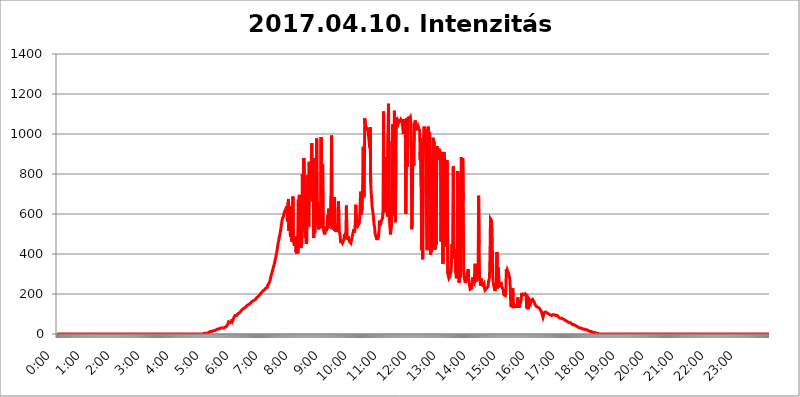
| Category | 2017.04.10. Intenzitás [W/m^2] |
|---|---|
| 0.0 | 0 |
| 0.0006944444444444445 | 0 |
| 0.001388888888888889 | 0 |
| 0.0020833333333333333 | 0 |
| 0.002777777777777778 | 0 |
| 0.003472222222222222 | 0 |
| 0.004166666666666667 | 0 |
| 0.004861111111111111 | 0 |
| 0.005555555555555556 | 0 |
| 0.0062499999999999995 | 0 |
| 0.006944444444444444 | 0 |
| 0.007638888888888889 | 0 |
| 0.008333333333333333 | 0 |
| 0.009027777777777779 | 0 |
| 0.009722222222222222 | 0 |
| 0.010416666666666666 | 0 |
| 0.011111111111111112 | 0 |
| 0.011805555555555555 | 0 |
| 0.012499999999999999 | 0 |
| 0.013194444444444444 | 0 |
| 0.013888888888888888 | 0 |
| 0.014583333333333332 | 0 |
| 0.015277777777777777 | 0 |
| 0.015972222222222224 | 0 |
| 0.016666666666666666 | 0 |
| 0.017361111111111112 | 0 |
| 0.018055555555555557 | 0 |
| 0.01875 | 0 |
| 0.019444444444444445 | 0 |
| 0.02013888888888889 | 0 |
| 0.020833333333333332 | 0 |
| 0.02152777777777778 | 0 |
| 0.022222222222222223 | 0 |
| 0.02291666666666667 | 0 |
| 0.02361111111111111 | 0 |
| 0.024305555555555556 | 0 |
| 0.024999999999999998 | 0 |
| 0.025694444444444447 | 0 |
| 0.02638888888888889 | 0 |
| 0.027083333333333334 | 0 |
| 0.027777777777777776 | 0 |
| 0.02847222222222222 | 0 |
| 0.029166666666666664 | 0 |
| 0.029861111111111113 | 0 |
| 0.030555555555555555 | 0 |
| 0.03125 | 0 |
| 0.03194444444444445 | 0 |
| 0.03263888888888889 | 0 |
| 0.03333333333333333 | 0 |
| 0.034027777777777775 | 0 |
| 0.034722222222222224 | 0 |
| 0.035416666666666666 | 0 |
| 0.036111111111111115 | 0 |
| 0.03680555555555556 | 0 |
| 0.0375 | 0 |
| 0.03819444444444444 | 0 |
| 0.03888888888888889 | 0 |
| 0.03958333333333333 | 0 |
| 0.04027777777777778 | 0 |
| 0.04097222222222222 | 0 |
| 0.041666666666666664 | 0 |
| 0.042361111111111106 | 0 |
| 0.04305555555555556 | 0 |
| 0.043750000000000004 | 0 |
| 0.044444444444444446 | 0 |
| 0.04513888888888889 | 0 |
| 0.04583333333333334 | 0 |
| 0.04652777777777778 | 0 |
| 0.04722222222222222 | 0 |
| 0.04791666666666666 | 0 |
| 0.04861111111111111 | 0 |
| 0.049305555555555554 | 0 |
| 0.049999999999999996 | 0 |
| 0.05069444444444445 | 0 |
| 0.051388888888888894 | 0 |
| 0.052083333333333336 | 0 |
| 0.05277777777777778 | 0 |
| 0.05347222222222222 | 0 |
| 0.05416666666666667 | 0 |
| 0.05486111111111111 | 0 |
| 0.05555555555555555 | 0 |
| 0.05625 | 0 |
| 0.05694444444444444 | 0 |
| 0.057638888888888885 | 0 |
| 0.05833333333333333 | 0 |
| 0.05902777777777778 | 0 |
| 0.059722222222222225 | 0 |
| 0.06041666666666667 | 0 |
| 0.061111111111111116 | 0 |
| 0.06180555555555556 | 0 |
| 0.0625 | 0 |
| 0.06319444444444444 | 0 |
| 0.06388888888888888 | 0 |
| 0.06458333333333334 | 0 |
| 0.06527777777777778 | 0 |
| 0.06597222222222222 | 0 |
| 0.06666666666666667 | 0 |
| 0.06736111111111111 | 0 |
| 0.06805555555555555 | 0 |
| 0.06874999999999999 | 0 |
| 0.06944444444444443 | 0 |
| 0.07013888888888889 | 0 |
| 0.07083333333333333 | 0 |
| 0.07152777777777779 | 0 |
| 0.07222222222222223 | 0 |
| 0.07291666666666667 | 0 |
| 0.07361111111111111 | 0 |
| 0.07430555555555556 | 0 |
| 0.075 | 0 |
| 0.07569444444444444 | 0 |
| 0.0763888888888889 | 0 |
| 0.07708333333333334 | 0 |
| 0.07777777777777778 | 0 |
| 0.07847222222222222 | 0 |
| 0.07916666666666666 | 0 |
| 0.0798611111111111 | 0 |
| 0.08055555555555556 | 0 |
| 0.08125 | 0 |
| 0.08194444444444444 | 0 |
| 0.08263888888888889 | 0 |
| 0.08333333333333333 | 0 |
| 0.08402777777777777 | 0 |
| 0.08472222222222221 | 0 |
| 0.08541666666666665 | 0 |
| 0.08611111111111112 | 0 |
| 0.08680555555555557 | 0 |
| 0.08750000000000001 | 0 |
| 0.08819444444444445 | 0 |
| 0.08888888888888889 | 0 |
| 0.08958333333333333 | 0 |
| 0.09027777777777778 | 0 |
| 0.09097222222222222 | 0 |
| 0.09166666666666667 | 0 |
| 0.09236111111111112 | 0 |
| 0.09305555555555556 | 0 |
| 0.09375 | 0 |
| 0.09444444444444444 | 0 |
| 0.09513888888888888 | 0 |
| 0.09583333333333333 | 0 |
| 0.09652777777777777 | 0 |
| 0.09722222222222222 | 0 |
| 0.09791666666666667 | 0 |
| 0.09861111111111111 | 0 |
| 0.09930555555555555 | 0 |
| 0.09999999999999999 | 0 |
| 0.10069444444444443 | 0 |
| 0.1013888888888889 | 0 |
| 0.10208333333333335 | 0 |
| 0.10277777777777779 | 0 |
| 0.10347222222222223 | 0 |
| 0.10416666666666667 | 0 |
| 0.10486111111111111 | 0 |
| 0.10555555555555556 | 0 |
| 0.10625 | 0 |
| 0.10694444444444444 | 0 |
| 0.1076388888888889 | 0 |
| 0.10833333333333334 | 0 |
| 0.10902777777777778 | 0 |
| 0.10972222222222222 | 0 |
| 0.1111111111111111 | 0 |
| 0.11180555555555556 | 0 |
| 0.11180555555555556 | 0 |
| 0.1125 | 0 |
| 0.11319444444444444 | 0 |
| 0.11388888888888889 | 0 |
| 0.11458333333333333 | 0 |
| 0.11527777777777777 | 0 |
| 0.11597222222222221 | 0 |
| 0.11666666666666665 | 0 |
| 0.1173611111111111 | 0 |
| 0.11805555555555557 | 0 |
| 0.11944444444444445 | 0 |
| 0.12013888888888889 | 0 |
| 0.12083333333333333 | 0 |
| 0.12152777777777778 | 0 |
| 0.12222222222222223 | 0 |
| 0.12291666666666667 | 0 |
| 0.12291666666666667 | 0 |
| 0.12361111111111112 | 0 |
| 0.12430555555555556 | 0 |
| 0.125 | 0 |
| 0.12569444444444444 | 0 |
| 0.12638888888888888 | 0 |
| 0.12708333333333333 | 0 |
| 0.16875 | 0 |
| 0.12847222222222224 | 0 |
| 0.12916666666666668 | 0 |
| 0.12986111111111112 | 0 |
| 0.13055555555555556 | 0 |
| 0.13125 | 0 |
| 0.13194444444444445 | 0 |
| 0.1326388888888889 | 0 |
| 0.13333333333333333 | 0 |
| 0.13402777777777777 | 0 |
| 0.13402777777777777 | 0 |
| 0.13472222222222222 | 0 |
| 0.13541666666666666 | 0 |
| 0.1361111111111111 | 0 |
| 0.13749999999999998 | 0 |
| 0.13819444444444443 | 0 |
| 0.1388888888888889 | 0 |
| 0.13958333333333334 | 0 |
| 0.14027777777777778 | 0 |
| 0.14097222222222222 | 0 |
| 0.14166666666666666 | 0 |
| 0.1423611111111111 | 0 |
| 0.14305555555555557 | 0 |
| 0.14375000000000002 | 0 |
| 0.14444444444444446 | 0 |
| 0.1451388888888889 | 0 |
| 0.1451388888888889 | 0 |
| 0.14652777777777778 | 0 |
| 0.14722222222222223 | 0 |
| 0.14791666666666667 | 0 |
| 0.1486111111111111 | 0 |
| 0.14930555555555555 | 0 |
| 0.15 | 0 |
| 0.15069444444444444 | 0 |
| 0.15138888888888888 | 0 |
| 0.15208333333333332 | 0 |
| 0.15277777777777776 | 0 |
| 0.15347222222222223 | 0 |
| 0.15416666666666667 | 0 |
| 0.15486111111111112 | 0 |
| 0.15555555555555556 | 0 |
| 0.15625 | 0 |
| 0.15694444444444444 | 0 |
| 0.15763888888888888 | 0 |
| 0.15833333333333333 | 0 |
| 0.15902777777777777 | 0 |
| 0.15972222222222224 | 0 |
| 0.16041666666666668 | 0 |
| 0.16111111111111112 | 0 |
| 0.16180555555555556 | 0 |
| 0.1625 | 0 |
| 0.16319444444444445 | 0 |
| 0.1638888888888889 | 0 |
| 0.16458333333333333 | 0 |
| 0.16527777777777777 | 0 |
| 0.16597222222222222 | 0 |
| 0.16666666666666666 | 0 |
| 0.1673611111111111 | 0 |
| 0.16805555555555554 | 0 |
| 0.16874999999999998 | 0 |
| 0.16944444444444443 | 0 |
| 0.17013888888888887 | 0 |
| 0.1708333333333333 | 0 |
| 0.17152777777777775 | 0 |
| 0.17222222222222225 | 0 |
| 0.1729166666666667 | 0 |
| 0.17361111111111113 | 0 |
| 0.17430555555555557 | 0 |
| 0.17500000000000002 | 0 |
| 0.17569444444444446 | 0 |
| 0.1763888888888889 | 0 |
| 0.17708333333333334 | 0 |
| 0.17777777777777778 | 0 |
| 0.17847222222222223 | 0 |
| 0.17916666666666667 | 0 |
| 0.1798611111111111 | 0 |
| 0.18055555555555555 | 0 |
| 0.18125 | 0 |
| 0.18194444444444444 | 0 |
| 0.1826388888888889 | 0 |
| 0.18333333333333335 | 0 |
| 0.1840277777777778 | 0 |
| 0.18472222222222223 | 0 |
| 0.18541666666666667 | 0 |
| 0.18611111111111112 | 0 |
| 0.18680555555555556 | 0 |
| 0.1875 | 0 |
| 0.18819444444444444 | 0 |
| 0.18888888888888888 | 0 |
| 0.18958333333333333 | 0 |
| 0.19027777777777777 | 0 |
| 0.1909722222222222 | 0 |
| 0.19166666666666665 | 0 |
| 0.19236111111111112 | 0 |
| 0.19305555555555554 | 0 |
| 0.19375 | 0 |
| 0.19444444444444445 | 0 |
| 0.1951388888888889 | 0 |
| 0.19583333333333333 | 0 |
| 0.19652777777777777 | 0 |
| 0.19722222222222222 | 0 |
| 0.19791666666666666 | 0 |
| 0.1986111111111111 | 0 |
| 0.19930555555555554 | 0 |
| 0.19999999999999998 | 0 |
| 0.20069444444444443 | 0 |
| 0.20138888888888887 | 0 |
| 0.2020833333333333 | 0 |
| 0.2027777777777778 | 0 |
| 0.2034722222222222 | 0 |
| 0.2041666666666667 | 0 |
| 0.20486111111111113 | 0 |
| 0.20555555555555557 | 0 |
| 0.20625000000000002 | 3.525 |
| 0.20694444444444446 | 3.525 |
| 0.2076388888888889 | 3.525 |
| 0.20833333333333334 | 3.525 |
| 0.20902777777777778 | 3.525 |
| 0.20972222222222223 | 3.525 |
| 0.21041666666666667 | 3.525 |
| 0.2111111111111111 | 7.887 |
| 0.21180555555555555 | 7.887 |
| 0.2125 | 7.887 |
| 0.21319444444444444 | 7.887 |
| 0.2138888888888889 | 7.887 |
| 0.21458333333333335 | 12.257 |
| 0.2152777777777778 | 12.257 |
| 0.21597222222222223 | 12.257 |
| 0.21666666666666667 | 12.257 |
| 0.21736111111111112 | 12.257 |
| 0.21805555555555556 | 16.636 |
| 0.21875 | 16.636 |
| 0.21944444444444444 | 16.636 |
| 0.22013888888888888 | 16.636 |
| 0.22083333333333333 | 16.636 |
| 0.22152777777777777 | 21.024 |
| 0.2222222222222222 | 21.024 |
| 0.22291666666666665 | 21.024 |
| 0.2236111111111111 | 21.024 |
| 0.22430555555555556 | 21.024 |
| 0.225 | 25.419 |
| 0.22569444444444445 | 25.419 |
| 0.2263888888888889 | 25.419 |
| 0.22708333333333333 | 25.419 |
| 0.22777777777777777 | 25.419 |
| 0.22847222222222222 | 25.419 |
| 0.22916666666666666 | 29.823 |
| 0.2298611111111111 | 29.823 |
| 0.23055555555555554 | 29.823 |
| 0.23124999999999998 | 29.823 |
| 0.23194444444444443 | 29.823 |
| 0.23263888888888887 | 29.823 |
| 0.2333333333333333 | 29.823 |
| 0.2340277777777778 | 34.234 |
| 0.2347222222222222 | 34.234 |
| 0.2354166666666667 | 34.234 |
| 0.23611111111111113 | 38.653 |
| 0.23680555555555557 | 38.653 |
| 0.23750000000000002 | 38.653 |
| 0.23819444444444446 | 43.079 |
| 0.2388888888888889 | 47.511 |
| 0.23958333333333334 | 47.511 |
| 0.24027777777777778 | 60.85 |
| 0.24097222222222223 | 60.85 |
| 0.24166666666666667 | 65.31 |
| 0.2423611111111111 | 56.398 |
| 0.24305555555555555 | 51.951 |
| 0.24375 | 51.951 |
| 0.24444444444444446 | 60.85 |
| 0.24513888888888888 | 74.246 |
| 0.24583333333333335 | 65.31 |
| 0.2465277777777778 | 65.31 |
| 0.24722222222222223 | 65.31 |
| 0.24791666666666667 | 83.205 |
| 0.24861111111111112 | 87.692 |
| 0.24930555555555556 | 92.184 |
| 0.25 | 92.184 |
| 0.25069444444444444 | 92.184 |
| 0.2513888888888889 | 92.184 |
| 0.2520833333333333 | 96.682 |
| 0.25277777777777777 | 96.682 |
| 0.2534722222222222 | 101.184 |
| 0.25416666666666665 | 101.184 |
| 0.2548611111111111 | 101.184 |
| 0.2555555555555556 | 105.69 |
| 0.25625000000000003 | 110.201 |
| 0.2569444444444445 | 110.201 |
| 0.2576388888888889 | 114.716 |
| 0.25833333333333336 | 114.716 |
| 0.2590277777777778 | 119.235 |
| 0.25972222222222224 | 123.758 |
| 0.2604166666666667 | 123.758 |
| 0.2611111111111111 | 123.758 |
| 0.26180555555555557 | 128.284 |
| 0.2625 | 128.284 |
| 0.26319444444444445 | 132.814 |
| 0.2638888888888889 | 132.814 |
| 0.26458333333333334 | 137.347 |
| 0.2652777777777778 | 137.347 |
| 0.2659722222222222 | 141.884 |
| 0.26666666666666666 | 141.884 |
| 0.2673611111111111 | 146.423 |
| 0.26805555555555555 | 146.423 |
| 0.26875 | 146.423 |
| 0.26944444444444443 | 150.964 |
| 0.2701388888888889 | 150.964 |
| 0.2708333333333333 | 155.509 |
| 0.27152777777777776 | 155.509 |
| 0.2722222222222222 | 160.056 |
| 0.27291666666666664 | 160.056 |
| 0.2736111111111111 | 160.056 |
| 0.2743055555555555 | 164.605 |
| 0.27499999999999997 | 164.605 |
| 0.27569444444444446 | 169.156 |
| 0.27638888888888885 | 169.156 |
| 0.27708333333333335 | 173.709 |
| 0.2777777777777778 | 173.709 |
| 0.27847222222222223 | 173.709 |
| 0.2791666666666667 | 178.264 |
| 0.2798611111111111 | 182.82 |
| 0.28055555555555556 | 182.82 |
| 0.28125 | 187.378 |
| 0.28194444444444444 | 187.378 |
| 0.2826388888888889 | 191.937 |
| 0.2833333333333333 | 191.937 |
| 0.28402777777777777 | 196.497 |
| 0.2847222222222222 | 201.058 |
| 0.28541666666666665 | 201.058 |
| 0.28611111111111115 | 205.62 |
| 0.28680555555555554 | 210.182 |
| 0.28750000000000003 | 210.182 |
| 0.2881944444444445 | 214.746 |
| 0.2888888888888889 | 214.746 |
| 0.28958333333333336 | 219.309 |
| 0.2902777777777778 | 219.309 |
| 0.29097222222222224 | 223.873 |
| 0.2916666666666667 | 223.873 |
| 0.2923611111111111 | 228.436 |
| 0.29305555555555557 | 228.436 |
| 0.29375 | 228.436 |
| 0.29444444444444445 | 233 |
| 0.2951388888888889 | 242.127 |
| 0.29583333333333334 | 246.689 |
| 0.2965277777777778 | 251.251 |
| 0.2972222222222222 | 255.813 |
| 0.29791666666666666 | 260.373 |
| 0.2986111111111111 | 269.49 |
| 0.29930555555555555 | 283.156 |
| 0.3 | 292.259 |
| 0.30069444444444443 | 301.354 |
| 0.3013888888888889 | 310.44 |
| 0.3020833333333333 | 319.517 |
| 0.30277777777777776 | 328.584 |
| 0.3034722222222222 | 337.639 |
| 0.30416666666666664 | 342.162 |
| 0.3048611111111111 | 355.712 |
| 0.3055555555555555 | 369.23 |
| 0.30624999999999997 | 378.224 |
| 0.3069444444444444 | 391.685 |
| 0.3076388888888889 | 405.108 |
| 0.30833333333333335 | 418.492 |
| 0.3090277777777778 | 436.27 |
| 0.30972222222222223 | 453.968 |
| 0.3104166666666667 | 462.786 |
| 0.3111111111111111 | 480.356 |
| 0.31180555555555556 | 489.108 |
| 0.3125 | 502.192 |
| 0.31319444444444444 | 515.223 |
| 0.3138888888888889 | 532.513 |
| 0.3145833333333333 | 549.704 |
| 0.31527777777777777 | 566.793 |
| 0.3159722222222222 | 579.542 |
| 0.31666666666666665 | 583.779 |
| 0.31736111111111115 | 588.009 |
| 0.31805555555555554 | 604.864 |
| 0.31875000000000003 | 609.062 |
| 0.3194444444444445 | 617.436 |
| 0.3201388888888889 | 617.436 |
| 0.32083333333333336 | 625.784 |
| 0.3215277777777778 | 638.256 |
| 0.32222222222222224 | 617.436 |
| 0.3229166666666667 | 562.53 |
| 0.3236111111111111 | 654.791 |
| 0.32430555555555557 | 675.311 |
| 0.325 | 515.223 |
| 0.32569444444444445 | 634.105 |
| 0.3263888888888889 | 549.704 |
| 0.32708333333333334 | 484.735 |
| 0.3277777777777778 | 506.542 |
| 0.3284722222222222 | 638.256 |
| 0.32916666666666666 | 462.786 |
| 0.3298611111111111 | 532.513 |
| 0.33055555555555555 | 687.544 |
| 0.33125 | 467.187 |
| 0.33194444444444443 | 467.187 |
| 0.3326388888888889 | 440.702 |
| 0.3333333333333333 | 489.108 |
| 0.3340277777777778 | 471.582 |
| 0.3347222222222222 | 409.574 |
| 0.3354166666666667 | 427.39 |
| 0.3361111111111111 | 400.638 |
| 0.3368055555555556 | 489.108 |
| 0.33749999999999997 | 405.108 |
| 0.33819444444444446 | 671.22 |
| 0.33888888888888885 | 475.972 |
| 0.33958333333333335 | 695.666 |
| 0.34027777777777773 | 471.582 |
| 0.34097222222222223 | 588.009 |
| 0.3416666666666666 | 431.833 |
| 0.3423611111111111 | 427.39 |
| 0.3430555555555555 | 453.968 |
| 0.34375 | 798.974 |
| 0.3444444444444445 | 658.909 |
| 0.3451388888888889 | 510.885 |
| 0.3458333333333334 | 879.719 |
| 0.34652777777777777 | 879.719 |
| 0.34722222222222227 | 600.661 |
| 0.34791666666666665 | 480.356 |
| 0.34861111111111115 | 675.311 |
| 0.34930555555555554 | 449.551 |
| 0.35000000000000003 | 462.786 |
| 0.3506944444444444 | 467.187 |
| 0.3513888888888889 | 795.074 |
| 0.3520833333333333 | 575.299 |
| 0.3527777777777778 | 536.82 |
| 0.3534722222222222 | 860.676 |
| 0.3541666666666667 | 687.544 |
| 0.3548611111111111 | 798.974 |
| 0.35555555555555557 | 683.473 |
| 0.35625 | 719.877 |
| 0.35694444444444445 | 955.071 |
| 0.3576388888888889 | 663.019 |
| 0.35833333333333334 | 791.169 |
| 0.3590277777777778 | 879.719 |
| 0.3597222222222222 | 480.356 |
| 0.36041666666666666 | 715.858 |
| 0.3611111111111111 | 506.542 |
| 0.36180555555555555 | 679.395 |
| 0.3625 | 545.416 |
| 0.36319444444444443 | 588.009 |
| 0.3638888888888889 | 977.508 |
| 0.3645833333333333 | 588.009 |
| 0.3652777777777778 | 658.909 |
| 0.3659722222222222 | 523.88 |
| 0.3666666666666667 | 541.121 |
| 0.3673611111111111 | 545.416 |
| 0.3680555555555556 | 642.4 |
| 0.36874999999999997 | 596.45 |
| 0.36944444444444446 | 528.2 |
| 0.37013888888888885 | 984.98 |
| 0.37083333333333335 | 541.121 |
| 0.37152777777777773 | 755.766 |
| 0.37222222222222223 | 849.199 |
| 0.3729166666666666 | 549.704 |
| 0.3736111111111111 | 515.223 |
| 0.3743055555555555 | 515.223 |
| 0.375 | 497.836 |
| 0.3756944444444445 | 515.223 |
| 0.3763888888888889 | 536.82 |
| 0.3770833333333334 | 515.223 |
| 0.37777777777777777 | 515.223 |
| 0.37847222222222227 | 528.2 |
| 0.37916666666666665 | 592.233 |
| 0.37986111111111115 | 528.2 |
| 0.38055555555555554 | 625.784 |
| 0.38125000000000003 | 571.049 |
| 0.3819444444444444 | 613.252 |
| 0.3826388888888889 | 621.613 |
| 0.3833333333333333 | 541.121 |
| 0.3840277777777778 | 691.608 |
| 0.3847222222222222 | 992.448 |
| 0.3854166666666667 | 523.88 |
| 0.3861111111111111 | 532.513 |
| 0.38680555555555557 | 613.252 |
| 0.3875 | 549.704 |
| 0.38819444444444445 | 532.513 |
| 0.3888888888888889 | 683.473 |
| 0.38958333333333334 | 515.223 |
| 0.3902777777777778 | 536.82 |
| 0.3909722222222222 | 510.885 |
| 0.39166666666666666 | 506.542 |
| 0.3923611111111111 | 528.2 |
| 0.39305555555555555 | 528.2 |
| 0.39375 | 515.223 |
| 0.39444444444444443 | 663.019 |
| 0.3951388888888889 | 523.88 |
| 0.3958333333333333 | 506.542 |
| 0.3965277777777778 | 497.836 |
| 0.3972222222222222 | 467.187 |
| 0.3979166666666667 | 453.968 |
| 0.3986111111111111 | 462.786 |
| 0.3993055555555556 | 458.38 |
| 0.39999999999999997 | 453.968 |
| 0.40069444444444446 | 449.551 |
| 0.40138888888888885 | 458.38 |
| 0.40208333333333335 | 471.582 |
| 0.40277777777777773 | 497.836 |
| 0.40347222222222223 | 475.972 |
| 0.4041666666666666 | 497.836 |
| 0.4048611111111111 | 510.885 |
| 0.4055555555555555 | 642.4 |
| 0.40625 | 484.735 |
| 0.4069444444444445 | 471.582 |
| 0.4076388888888889 | 489.108 |
| 0.4083333333333334 | 484.735 |
| 0.40902777777777777 | 471.582 |
| 0.40972222222222227 | 462.786 |
| 0.41041666666666665 | 467.187 |
| 0.41111111111111115 | 462.786 |
| 0.41180555555555554 | 453.968 |
| 0.41250000000000003 | 458.38 |
| 0.4131944444444444 | 475.972 |
| 0.4138888888888889 | 471.582 |
| 0.4145833333333333 | 480.356 |
| 0.4152777777777778 | 515.223 |
| 0.4159722222222222 | 523.88 |
| 0.4166666666666667 | 506.542 |
| 0.4173611111111111 | 519.555 |
| 0.41805555555555557 | 558.261 |
| 0.41875 | 646.537 |
| 0.41944444444444445 | 575.299 |
| 0.4201388888888889 | 532.513 |
| 0.42083333333333334 | 553.986 |
| 0.4215277777777778 | 575.299 |
| 0.4222222222222222 | 545.416 |
| 0.42291666666666666 | 545.416 |
| 0.4236111111111111 | 553.986 |
| 0.42430555555555555 | 583.779 |
| 0.425 | 671.22 |
| 0.42569444444444443 | 711.832 |
| 0.4263888888888889 | 596.45 |
| 0.4270833333333333 | 600.661 |
| 0.4277777777777778 | 634.105 |
| 0.4284722222222222 | 759.723 |
| 0.4291666666666667 | 936.33 |
| 0.4298611111111111 | 683.473 |
| 0.4305555555555556 | 695.666 |
| 0.43124999999999997 | 1078.555 |
| 0.43194444444444446 | 1052.255 |
| 0.43263888888888885 | 1041.019 |
| 0.43333333333333335 | 1033.537 |
| 0.43402777777777773 | 1029.798 |
| 0.43472222222222223 | 1026.06 |
| 0.4354166666666666 | 1018.587 |
| 0.4361111111111111 | 1011.118 |
| 0.4368055555555555 | 1011.118 |
| 0.4375 | 1007.383 |
| 0.4381944444444445 | 932.576 |
| 0.4388888888888889 | 1033.537 |
| 0.4395833333333334 | 755.766 |
| 0.44027777777777777 | 711.832 |
| 0.44097222222222227 | 675.311 |
| 0.44166666666666665 | 634.105 |
| 0.44236111111111115 | 617.436 |
| 0.44305555555555554 | 600.661 |
| 0.44375000000000003 | 571.049 |
| 0.4444444444444444 | 545.416 |
| 0.4451388888888889 | 532.513 |
| 0.4458333333333333 | 502.192 |
| 0.4465277777777778 | 493.475 |
| 0.4472222222222222 | 484.735 |
| 0.4479166666666667 | 475.972 |
| 0.4486111111111111 | 471.582 |
| 0.44930555555555557 | 471.582 |
| 0.45 | 475.972 |
| 0.45069444444444445 | 493.475 |
| 0.4513888888888889 | 519.555 |
| 0.45208333333333334 | 566.793 |
| 0.4527777777777778 | 541.121 |
| 0.4534722222222222 | 536.82 |
| 0.45416666666666666 | 562.53 |
| 0.4548611111111111 | 562.53 |
| 0.45555555555555555 | 566.793 |
| 0.45625 | 579.542 |
| 0.45694444444444443 | 621.613 |
| 0.4576388888888889 | 1112.618 |
| 0.4583333333333333 | 634.105 |
| 0.4590277777777778 | 675.311 |
| 0.4597222222222222 | 609.062 |
| 0.4604166666666667 | 654.791 |
| 0.4611111111111111 | 883.516 |
| 0.4618055555555556 | 845.365 |
| 0.46249999999999997 | 723.889 |
| 0.46319444444444446 | 588.009 |
| 0.46388888888888885 | 999.916 |
| 0.46458333333333335 | 1150.946 |
| 0.46527777777777773 | 617.436 |
| 0.46597222222222223 | 571.049 |
| 0.4666666666666666 | 532.513 |
| 0.4673611111111111 | 497.836 |
| 0.4680555555555555 | 523.88 |
| 0.46875 | 541.121 |
| 0.4694444444444445 | 962.555 |
| 0.4701388888888889 | 763.674 |
| 0.4708333333333334 | 1048.508 |
| 0.47152777777777777 | 592.233 |
| 0.47222222222222227 | 940.082 |
| 0.47291666666666665 | 1116.426 |
| 0.47361111111111115 | 860.676 |
| 0.47430555555555554 | 558.261 |
| 0.47500000000000003 | 902.447 |
| 0.4756944444444444 | 1082.324 |
| 0.4763888888888889 | 1059.756 |
| 0.4770833333333333 | 1052.255 |
| 0.4777777777777778 | 1063.51 |
| 0.4784722222222222 | 1056.004 |
| 0.4791666666666667 | 1059.756 |
| 0.4798611111111111 | 1074.789 |
| 0.48055555555555557 | 1056.004 |
| 0.48125 | 1059.756 |
| 0.48194444444444445 | 1071.027 |
| 0.4826388888888889 | 1071.027 |
| 0.48333333333333334 | 1067.267 |
| 0.4840277777777778 | 1056.004 |
| 0.4847222222222222 | 1059.756 |
| 0.48541666666666666 | 999.916 |
| 0.4861111111111111 | 1074.789 |
| 0.48680555555555555 | 1029.798 |
| 0.4875 | 1063.51 |
| 0.48819444444444443 | 1003.65 |
| 0.4888888888888889 | 600.661 |
| 0.4895833333333333 | 906.223 |
| 0.4902777777777778 | 1078.555 |
| 0.4909722222222222 | 837.682 |
| 0.4916666666666667 | 984.98 |
| 0.4923611111111111 | 1086.097 |
| 0.4930555555555556 | 1071.027 |
| 0.49374999999999997 | 1078.555 |
| 0.49444444444444446 | 1074.789 |
| 0.49513888888888885 | 1086.097 |
| 0.49583333333333335 | 1063.51 |
| 0.49652777777777773 | 875.918 |
| 0.49722222222222223 | 523.88 |
| 0.4979166666666666 | 566.793 |
| 0.4986111111111111 | 879.719 |
| 0.4993055555555555 | 958.814 |
| 0.5 | 841.526 |
| 0.5006944444444444 | 1052.255 |
| 0.5013888888888889 | 1037.277 |
| 0.5020833333333333 | 1067.267 |
| 0.5027777777777778 | 1048.508 |
| 0.5034722222222222 | 1022.323 |
| 0.5041666666666667 | 1037.277 |
| 0.5048611111111111 | 1018.587 |
| 0.5055555555555555 | 1022.323 |
| 0.50625 | 1037.277 |
| 0.5069444444444444 | 1029.798 |
| 0.5076388888888889 | 1022.323 |
| 0.5083333333333333 | 1014.852 |
| 0.5090277777777777 | 868.305 |
| 0.5097222222222222 | 977.508 |
| 0.5104166666666666 | 735.89 |
| 0.5111111111111112 | 418.492 |
| 0.5118055555555555 | 642.4 |
| 0.5125000000000001 | 373.729 |
| 0.5131944444444444 | 791.169 |
| 0.513888888888889 | 996.182 |
| 0.5145833333333333 | 1037.277 |
| 0.5152777777777778 | 996.182 |
| 0.5159722222222222 | 999.916 |
| 0.5166666666666667 | 1007.383 |
| 0.517361111111111 | 999.916 |
| 0.5180555555555556 | 545.416 |
| 0.5187499999999999 | 418.492 |
| 0.5194444444444445 | 1014.852 |
| 0.5201388888888888 | 1037.277 |
| 0.5208333333333334 | 1011.118 |
| 0.5215277777777778 | 715.858 |
| 0.5222222222222223 | 1007.383 |
| 0.5229166666666667 | 810.641 |
| 0.5236111111111111 | 396.164 |
| 0.5243055555555556 | 558.261 |
| 0.525 | 409.574 |
| 0.5256944444444445 | 471.582 |
| 0.5263888888888889 | 875.918 |
| 0.5270833333333333 | 981.244 |
| 0.5277777777777778 | 940.082 |
| 0.5284722222222222 | 962.555 |
| 0.5291666666666667 | 966.295 |
| 0.5298611111111111 | 422.943 |
| 0.5305555555555556 | 617.436 |
| 0.53125 | 445.129 |
| 0.5319444444444444 | 743.859 |
| 0.5326388888888889 | 940.082 |
| 0.5333333333333333 | 872.114 |
| 0.5340277777777778 | 921.298 |
| 0.5347222222222222 | 925.06 |
| 0.5354166666666667 | 921.298 |
| 0.5361111111111111 | 921.298 |
| 0.5368055555555555 | 913.766 |
| 0.5375 | 875.918 |
| 0.5381944444444444 | 462.786 |
| 0.5388888888888889 | 864.493 |
| 0.5395833333333333 | 894.885 |
| 0.5402777777777777 | 909.996 |
| 0.5409722222222222 | 351.198 |
| 0.5416666666666666 | 596.45 |
| 0.5423611111111112 | 909.996 |
| 0.5430555555555555 | 913.766 |
| 0.5437500000000001 | 909.996 |
| 0.5444444444444444 | 826.123 |
| 0.545138888888889 | 583.779 |
| 0.5458333333333333 | 436.27 |
| 0.5465277777777778 | 868.305 |
| 0.5472222222222222 | 868.305 |
| 0.5479166666666667 | 301.354 |
| 0.548611111111111 | 296.808 |
| 0.5493055555555556 | 278.603 |
| 0.5499999999999999 | 278.603 |
| 0.5506944444444445 | 287.709 |
| 0.5513888888888888 | 301.354 |
| 0.5520833333333334 | 310.44 |
| 0.5527777777777778 | 342.162 |
| 0.5534722222222223 | 449.551 |
| 0.5541666666666667 | 449.551 |
| 0.5548611111111111 | 378.224 |
| 0.5555555555555556 | 837.682 |
| 0.55625 | 378.224 |
| 0.5569444444444445 | 387.202 |
| 0.5576388888888889 | 409.574 |
| 0.5583333333333333 | 422.943 |
| 0.5590277777777778 | 305.898 |
| 0.5597222222222222 | 278.603 |
| 0.5604166666666667 | 296.808 |
| 0.5611111111111111 | 287.709 |
| 0.5618055555555556 | 814.519 |
| 0.5625 | 711.832 |
| 0.5631944444444444 | 269.49 |
| 0.5638888888888889 | 255.813 |
| 0.5645833333333333 | 346.682 |
| 0.5652777777777778 | 283.156 |
| 0.5659722222222222 | 328.584 |
| 0.5666666666666667 | 883.516 |
| 0.5673611111111111 | 853.029 |
| 0.5680555555555555 | 868.305 |
| 0.56875 | 879.719 |
| 0.5694444444444444 | 671.22 |
| 0.5701388888888889 | 310.44 |
| 0.5708333333333333 | 278.603 |
| 0.5715277777777777 | 269.49 |
| 0.5722222222222222 | 255.813 |
| 0.5729166666666666 | 260.373 |
| 0.5736111111111112 | 274.047 |
| 0.5743055555555555 | 287.709 |
| 0.5750000000000001 | 287.709 |
| 0.5756944444444444 | 283.156 |
| 0.576388888888889 | 324.052 |
| 0.5770833333333333 | 264.932 |
| 0.5777777777777778 | 251.251 |
| 0.5784722222222222 | 237.564 |
| 0.5791666666666667 | 223.873 |
| 0.579861111111111 | 228.436 |
| 0.5805555555555556 | 223.873 |
| 0.5812499999999999 | 228.436 |
| 0.5819444444444445 | 255.813 |
| 0.5826388888888888 | 283.156 |
| 0.5833333333333334 | 264.932 |
| 0.5840277777777778 | 260.373 |
| 0.5847222222222223 | 255.813 |
| 0.5854166666666667 | 260.373 |
| 0.5861111111111111 | 351.198 |
| 0.5868055555555556 | 264.932 |
| 0.5875 | 260.373 |
| 0.5881944444444445 | 260.373 |
| 0.5888888888888889 | 269.49 |
| 0.5895833333333333 | 283.156 |
| 0.5902777777777778 | 292.259 |
| 0.5909722222222222 | 691.608 |
| 0.5916666666666667 | 440.702 |
| 0.5923611111111111 | 278.603 |
| 0.5930555555555556 | 264.932 |
| 0.59375 | 242.127 |
| 0.5944444444444444 | 278.603 |
| 0.5951388888888889 | 246.689 |
| 0.5958333333333333 | 246.689 |
| 0.5965277777777778 | 242.127 |
| 0.5972222222222222 | 242.127 |
| 0.5979166666666667 | 242.127 |
| 0.5986111111111111 | 251.251 |
| 0.5993055555555555 | 228.436 |
| 0.6 | 219.309 |
| 0.6006944444444444 | 219.309 |
| 0.6013888888888889 | 223.873 |
| 0.6020833333333333 | 228.436 |
| 0.6027777777777777 | 228.436 |
| 0.6034722222222222 | 228.436 |
| 0.6041666666666666 | 237.564 |
| 0.6048611111111112 | 260.373 |
| 0.6055555555555555 | 260.373 |
| 0.6062500000000001 | 283.156 |
| 0.6069444444444444 | 387.202 |
| 0.607638888888889 | 575.299 |
| 0.6083333333333333 | 575.299 |
| 0.6090277777777778 | 566.793 |
| 0.6097222222222222 | 523.88 |
| 0.6104166666666667 | 391.685 |
| 0.611111111111111 | 264.932 |
| 0.6118055555555556 | 251.251 |
| 0.6124999999999999 | 237.564 |
| 0.6131944444444445 | 228.436 |
| 0.6138888888888888 | 214.746 |
| 0.6145833333333334 | 214.746 |
| 0.6152777777777778 | 242.127 |
| 0.6159722222222223 | 233 |
| 0.6166666666666667 | 409.574 |
| 0.6173611111111111 | 228.436 |
| 0.6180555555555556 | 251.251 |
| 0.61875 | 333.113 |
| 0.6194444444444445 | 237.564 |
| 0.6201388888888889 | 233 |
| 0.6208333333333333 | 233 |
| 0.6215277777777778 | 242.127 |
| 0.6222222222222222 | 260.373 |
| 0.6229166666666667 | 242.127 |
| 0.6236111111111111 | 237.564 |
| 0.6243055555555556 | 237.564 |
| 0.625 | 223.873 |
| 0.6256944444444444 | 214.746 |
| 0.6263888888888889 | 196.497 |
| 0.6270833333333333 | 191.937 |
| 0.6277777777777778 | 196.497 |
| 0.6284722222222222 | 191.937 |
| 0.6291666666666667 | 205.62 |
| 0.6298611111111111 | 324.052 |
| 0.6305555555555555 | 305.898 |
| 0.63125 | 319.517 |
| 0.6319444444444444 | 314.98 |
| 0.6326388888888889 | 305.898 |
| 0.6333333333333333 | 296.808 |
| 0.6340277777777777 | 287.709 |
| 0.6347222222222222 | 278.603 |
| 0.6354166666666666 | 223.873 |
| 0.6361111111111112 | 141.884 |
| 0.6368055555555555 | 137.347 |
| 0.6375000000000001 | 137.347 |
| 0.6381944444444444 | 137.347 |
| 0.638888888888889 | 228.436 |
| 0.6395833333333333 | 141.884 |
| 0.6402777777777778 | 150.964 |
| 0.6409722222222222 | 137.347 |
| 0.6416666666666667 | 137.347 |
| 0.642361111111111 | 137.347 |
| 0.6430555555555556 | 137.347 |
| 0.6437499999999999 | 132.814 |
| 0.6444444444444445 | 132.814 |
| 0.6451388888888888 | 137.347 |
| 0.6458333333333334 | 182.82 |
| 0.6465277777777778 | 137.347 |
| 0.6472222222222223 | 137.347 |
| 0.6479166666666667 | 137.347 |
| 0.6486111111111111 | 137.347 |
| 0.6493055555555556 | 132.814 |
| 0.65 | 132.814 |
| 0.6506944444444445 | 173.709 |
| 0.6513888888888889 | 205.62 |
| 0.6520833333333333 | 196.497 |
| 0.6527777777777778 | 191.937 |
| 0.6534722222222222 | 201.058 |
| 0.6541666666666667 | 196.497 |
| 0.6548611111111111 | 196.497 |
| 0.6555555555555556 | 201.058 |
| 0.65625 | 201.058 |
| 0.6569444444444444 | 196.497 |
| 0.6576388888888889 | 191.937 |
| 0.6583333333333333 | 128.284 |
| 0.6590277777777778 | 137.347 |
| 0.6597222222222222 | 146.423 |
| 0.6604166666666667 | 123.758 |
| 0.6611111111111111 | 178.264 |
| 0.6618055555555555 | 173.709 |
| 0.6625 | 169.156 |
| 0.6631944444444444 | 173.709 |
| 0.6638888888888889 | 155.509 |
| 0.6645833333333333 | 169.156 |
| 0.6652777777777777 | 173.709 |
| 0.6659722222222222 | 173.709 |
| 0.6666666666666666 | 173.709 |
| 0.6673611111111111 | 169.156 |
| 0.6680555555555556 | 164.605 |
| 0.6687500000000001 | 160.056 |
| 0.6694444444444444 | 155.509 |
| 0.6701388888888888 | 146.423 |
| 0.6708333333333334 | 146.423 |
| 0.6715277777777778 | 141.884 |
| 0.6722222222222222 | 137.347 |
| 0.6729166666666666 | 132.814 |
| 0.6736111111111112 | 132.814 |
| 0.6743055555555556 | 132.814 |
| 0.6749999999999999 | 132.814 |
| 0.6756944444444444 | 128.284 |
| 0.6763888888888889 | 128.284 |
| 0.6770833333333334 | 123.758 |
| 0.6777777777777777 | 119.235 |
| 0.6784722222222223 | 114.716 |
| 0.6791666666666667 | 110.201 |
| 0.6798611111111111 | 110.201 |
| 0.6805555555555555 | 92.184 |
| 0.68125 | 83.205 |
| 0.6819444444444445 | 92.184 |
| 0.6826388888888889 | 105.69 |
| 0.6833333333333332 | 101.184 |
| 0.6840277777777778 | 110.201 |
| 0.6847222222222222 | 110.201 |
| 0.6854166666666667 | 110.201 |
| 0.686111111111111 | 110.201 |
| 0.6868055555555556 | 105.69 |
| 0.6875 | 110.201 |
| 0.6881944444444444 | 105.69 |
| 0.688888888888889 | 101.184 |
| 0.6895833333333333 | 101.184 |
| 0.6902777777777778 | 96.682 |
| 0.6909722222222222 | 96.682 |
| 0.6916666666666668 | 92.184 |
| 0.6923611111111111 | 92.184 |
| 0.6930555555555555 | 92.184 |
| 0.69375 | 96.682 |
| 0.6944444444444445 | 96.682 |
| 0.6951388888888889 | 96.682 |
| 0.6958333333333333 | 96.682 |
| 0.6965277777777777 | 96.682 |
| 0.6972222222222223 | 96.682 |
| 0.6979166666666666 | 92.184 |
| 0.6986111111111111 | 92.184 |
| 0.6993055555555556 | 92.184 |
| 0.7000000000000001 | 92.184 |
| 0.7006944444444444 | 92.184 |
| 0.7013888888888888 | 92.184 |
| 0.7020833333333334 | 87.692 |
| 0.7027777777777778 | 87.692 |
| 0.7034722222222222 | 83.205 |
| 0.7041666666666666 | 83.205 |
| 0.7048611111111112 | 83.205 |
| 0.7055555555555556 | 78.722 |
| 0.7062499999999999 | 78.722 |
| 0.7069444444444444 | 78.722 |
| 0.7076388888888889 | 78.722 |
| 0.7083333333333334 | 74.246 |
| 0.7090277777777777 | 74.246 |
| 0.7097222222222223 | 74.246 |
| 0.7104166666666667 | 74.246 |
| 0.7111111111111111 | 69.775 |
| 0.7118055555555555 | 69.775 |
| 0.7125 | 65.31 |
| 0.7131944444444445 | 65.31 |
| 0.7138888888888889 | 65.31 |
| 0.7145833333333332 | 65.31 |
| 0.7152777777777778 | 60.85 |
| 0.7159722222222222 | 60.85 |
| 0.7166666666666667 | 60.85 |
| 0.717361111111111 | 60.85 |
| 0.7180555555555556 | 56.398 |
| 0.71875 | 56.398 |
| 0.7194444444444444 | 56.398 |
| 0.720138888888889 | 56.398 |
| 0.7208333333333333 | 51.951 |
| 0.7215277777777778 | 51.951 |
| 0.7222222222222222 | 47.511 |
| 0.7229166666666668 | 47.511 |
| 0.7236111111111111 | 47.511 |
| 0.7243055555555555 | 47.511 |
| 0.725 | 43.079 |
| 0.7256944444444445 | 43.079 |
| 0.7263888888888889 | 43.079 |
| 0.7270833333333333 | 38.653 |
| 0.7277777777777777 | 38.653 |
| 0.7284722222222223 | 38.653 |
| 0.7291666666666666 | 38.653 |
| 0.7298611111111111 | 38.653 |
| 0.7305555555555556 | 34.234 |
| 0.7312500000000001 | 34.234 |
| 0.7319444444444444 | 34.234 |
| 0.7326388888888888 | 29.823 |
| 0.7333333333333334 | 29.823 |
| 0.7340277777777778 | 29.823 |
| 0.7347222222222222 | 29.823 |
| 0.7354166666666666 | 29.823 |
| 0.7361111111111112 | 25.419 |
| 0.7368055555555556 | 25.419 |
| 0.7374999999999999 | 25.419 |
| 0.7381944444444444 | 25.419 |
| 0.7388888888888889 | 25.419 |
| 0.7395833333333334 | 21.024 |
| 0.7402777777777777 | 21.024 |
| 0.7409722222222223 | 21.024 |
| 0.7416666666666667 | 21.024 |
| 0.7423611111111111 | 21.024 |
| 0.7430555555555555 | 21.024 |
| 0.74375 | 16.636 |
| 0.7444444444444445 | 16.636 |
| 0.7451388888888889 | 16.636 |
| 0.7458333333333332 | 16.636 |
| 0.7465277777777778 | 12.257 |
| 0.7472222222222222 | 12.257 |
| 0.7479166666666667 | 12.257 |
| 0.748611111111111 | 12.257 |
| 0.7493055555555556 | 12.257 |
| 0.75 | 12.257 |
| 0.7506944444444444 | 7.887 |
| 0.751388888888889 | 7.887 |
| 0.7520833333333333 | 7.887 |
| 0.7527777777777778 | 7.887 |
| 0.7534722222222222 | 7.887 |
| 0.7541666666666668 | 7.887 |
| 0.7548611111111111 | 3.525 |
| 0.7555555555555555 | 3.525 |
| 0.75625 | 3.525 |
| 0.7569444444444445 | 3.525 |
| 0.7576388888888889 | 3.525 |
| 0.7583333333333333 | 0 |
| 0.7590277777777777 | 3.525 |
| 0.7597222222222223 | 0 |
| 0.7604166666666666 | 0 |
| 0.7611111111111111 | 0 |
| 0.7618055555555556 | 0 |
| 0.7625000000000001 | 0 |
| 0.7631944444444444 | 0 |
| 0.7638888888888888 | 0 |
| 0.7645833333333334 | 0 |
| 0.7652777777777778 | 0 |
| 0.7659722222222222 | 0 |
| 0.7666666666666666 | 0 |
| 0.7673611111111112 | 0 |
| 0.7680555555555556 | 0 |
| 0.7687499999999999 | 0 |
| 0.7694444444444444 | 0 |
| 0.7701388888888889 | 0 |
| 0.7708333333333334 | 0 |
| 0.7715277777777777 | 0 |
| 0.7722222222222223 | 0 |
| 0.7729166666666667 | 0 |
| 0.7736111111111111 | 0 |
| 0.7743055555555555 | 0 |
| 0.775 | 0 |
| 0.7756944444444445 | 0 |
| 0.7763888888888889 | 0 |
| 0.7770833333333332 | 0 |
| 0.7777777777777778 | 0 |
| 0.7784722222222222 | 0 |
| 0.7791666666666667 | 0 |
| 0.779861111111111 | 0 |
| 0.7805555555555556 | 0 |
| 0.78125 | 0 |
| 0.7819444444444444 | 0 |
| 0.782638888888889 | 0 |
| 0.7833333333333333 | 0 |
| 0.7840277777777778 | 0 |
| 0.7847222222222222 | 0 |
| 0.7854166666666668 | 0 |
| 0.7861111111111111 | 0 |
| 0.7868055555555555 | 0 |
| 0.7875 | 0 |
| 0.7881944444444445 | 0 |
| 0.7888888888888889 | 0 |
| 0.7895833333333333 | 0 |
| 0.7902777777777777 | 0 |
| 0.7909722222222223 | 0 |
| 0.7916666666666666 | 0 |
| 0.7923611111111111 | 0 |
| 0.7930555555555556 | 0 |
| 0.7937500000000001 | 0 |
| 0.7944444444444444 | 0 |
| 0.7951388888888888 | 0 |
| 0.7958333333333334 | 0 |
| 0.7965277777777778 | 0 |
| 0.7972222222222222 | 0 |
| 0.7979166666666666 | 0 |
| 0.7986111111111112 | 0 |
| 0.7993055555555556 | 0 |
| 0.7999999999999999 | 0 |
| 0.8006944444444444 | 0 |
| 0.8013888888888889 | 0 |
| 0.8020833333333334 | 0 |
| 0.8027777777777777 | 0 |
| 0.8034722222222223 | 0 |
| 0.8041666666666667 | 0 |
| 0.8048611111111111 | 0 |
| 0.8055555555555555 | 0 |
| 0.80625 | 0 |
| 0.8069444444444445 | 0 |
| 0.8076388888888889 | 0 |
| 0.8083333333333332 | 0 |
| 0.8090277777777778 | 0 |
| 0.8097222222222222 | 0 |
| 0.8104166666666667 | 0 |
| 0.811111111111111 | 0 |
| 0.8118055555555556 | 0 |
| 0.8125 | 0 |
| 0.8131944444444444 | 0 |
| 0.813888888888889 | 0 |
| 0.8145833333333333 | 0 |
| 0.8152777777777778 | 0 |
| 0.8159722222222222 | 0 |
| 0.8166666666666668 | 0 |
| 0.8173611111111111 | 0 |
| 0.8180555555555555 | 0 |
| 0.81875 | 0 |
| 0.8194444444444445 | 0 |
| 0.8201388888888889 | 0 |
| 0.8208333333333333 | 0 |
| 0.8215277777777777 | 0 |
| 0.8222222222222223 | 0 |
| 0.8229166666666666 | 0 |
| 0.8236111111111111 | 0 |
| 0.8243055555555556 | 0 |
| 0.8250000000000001 | 0 |
| 0.8256944444444444 | 0 |
| 0.8263888888888888 | 0 |
| 0.8270833333333334 | 0 |
| 0.8277777777777778 | 0 |
| 0.8284722222222222 | 0 |
| 0.8291666666666666 | 0 |
| 0.8298611111111112 | 0 |
| 0.8305555555555556 | 0 |
| 0.8312499999999999 | 0 |
| 0.8319444444444444 | 0 |
| 0.8326388888888889 | 0 |
| 0.8333333333333334 | 0 |
| 0.8340277777777777 | 0 |
| 0.8347222222222223 | 0 |
| 0.8354166666666667 | 0 |
| 0.8361111111111111 | 0 |
| 0.8368055555555555 | 0 |
| 0.8375 | 0 |
| 0.8381944444444445 | 0 |
| 0.8388888888888889 | 0 |
| 0.8395833333333332 | 0 |
| 0.8402777777777778 | 0 |
| 0.8409722222222222 | 0 |
| 0.8416666666666667 | 0 |
| 0.842361111111111 | 0 |
| 0.8430555555555556 | 0 |
| 0.84375 | 0 |
| 0.8444444444444444 | 0 |
| 0.845138888888889 | 0 |
| 0.8458333333333333 | 0 |
| 0.8465277777777778 | 0 |
| 0.8472222222222222 | 0 |
| 0.8479166666666668 | 0 |
| 0.8486111111111111 | 0 |
| 0.8493055555555555 | 0 |
| 0.85 | 0 |
| 0.8506944444444445 | 0 |
| 0.8513888888888889 | 0 |
| 0.8520833333333333 | 0 |
| 0.8527777777777777 | 0 |
| 0.8534722222222223 | 0 |
| 0.8541666666666666 | 0 |
| 0.8548611111111111 | 0 |
| 0.8555555555555556 | 0 |
| 0.8562500000000001 | 0 |
| 0.8569444444444444 | 0 |
| 0.8576388888888888 | 0 |
| 0.8583333333333334 | 0 |
| 0.8590277777777778 | 0 |
| 0.8597222222222222 | 0 |
| 0.8604166666666666 | 0 |
| 0.8611111111111112 | 0 |
| 0.8618055555555556 | 0 |
| 0.8624999999999999 | 0 |
| 0.8631944444444444 | 0 |
| 0.8638888888888889 | 0 |
| 0.8645833333333334 | 0 |
| 0.8652777777777777 | 0 |
| 0.8659722222222223 | 0 |
| 0.8666666666666667 | 0 |
| 0.8673611111111111 | 0 |
| 0.8680555555555555 | 0 |
| 0.86875 | 0 |
| 0.8694444444444445 | 0 |
| 0.8701388888888889 | 0 |
| 0.8708333333333332 | 0 |
| 0.8715277777777778 | 0 |
| 0.8722222222222222 | 0 |
| 0.8729166666666667 | 0 |
| 0.873611111111111 | 0 |
| 0.8743055555555556 | 0 |
| 0.875 | 0 |
| 0.8756944444444444 | 0 |
| 0.876388888888889 | 0 |
| 0.8770833333333333 | 0 |
| 0.8777777777777778 | 0 |
| 0.8784722222222222 | 0 |
| 0.8791666666666668 | 0 |
| 0.8798611111111111 | 0 |
| 0.8805555555555555 | 0 |
| 0.88125 | 0 |
| 0.8819444444444445 | 0 |
| 0.8826388888888889 | 0 |
| 0.8833333333333333 | 0 |
| 0.8840277777777777 | 0 |
| 0.8847222222222223 | 0 |
| 0.8854166666666666 | 0 |
| 0.8861111111111111 | 0 |
| 0.8868055555555556 | 0 |
| 0.8875000000000001 | 0 |
| 0.8881944444444444 | 0 |
| 0.8888888888888888 | 0 |
| 0.8895833333333334 | 0 |
| 0.8902777777777778 | 0 |
| 0.8909722222222222 | 0 |
| 0.8916666666666666 | 0 |
| 0.8923611111111112 | 0 |
| 0.8930555555555556 | 0 |
| 0.8937499999999999 | 0 |
| 0.8944444444444444 | 0 |
| 0.8951388888888889 | 0 |
| 0.8958333333333334 | 0 |
| 0.8965277777777777 | 0 |
| 0.8972222222222223 | 0 |
| 0.8979166666666667 | 0 |
| 0.8986111111111111 | 0 |
| 0.8993055555555555 | 0 |
| 0.9 | 0 |
| 0.9006944444444445 | 0 |
| 0.9013888888888889 | 0 |
| 0.9020833333333332 | 0 |
| 0.9027777777777778 | 0 |
| 0.9034722222222222 | 0 |
| 0.9041666666666667 | 0 |
| 0.904861111111111 | 0 |
| 0.9055555555555556 | 0 |
| 0.90625 | 0 |
| 0.9069444444444444 | 0 |
| 0.907638888888889 | 0 |
| 0.9083333333333333 | 0 |
| 0.9090277777777778 | 0 |
| 0.9097222222222222 | 0 |
| 0.9104166666666668 | 0 |
| 0.9111111111111111 | 0 |
| 0.9118055555555555 | 0 |
| 0.9125 | 0 |
| 0.9131944444444445 | 0 |
| 0.9138888888888889 | 0 |
| 0.9145833333333333 | 0 |
| 0.9152777777777777 | 0 |
| 0.9159722222222223 | 0 |
| 0.9166666666666666 | 0 |
| 0.9173611111111111 | 0 |
| 0.9180555555555556 | 0 |
| 0.9187500000000001 | 0 |
| 0.9194444444444444 | 0 |
| 0.9201388888888888 | 0 |
| 0.9208333333333334 | 0 |
| 0.9215277777777778 | 0 |
| 0.9222222222222222 | 0 |
| 0.9229166666666666 | 0 |
| 0.9236111111111112 | 0 |
| 0.9243055555555556 | 0 |
| 0.9249999999999999 | 0 |
| 0.9256944444444444 | 0 |
| 0.9263888888888889 | 0 |
| 0.9270833333333334 | 0 |
| 0.9277777777777777 | 0 |
| 0.9284722222222223 | 0 |
| 0.9291666666666667 | 0 |
| 0.9298611111111111 | 0 |
| 0.9305555555555555 | 0 |
| 0.93125 | 0 |
| 0.9319444444444445 | 0 |
| 0.9326388888888889 | 0 |
| 0.9333333333333332 | 0 |
| 0.9340277777777778 | 0 |
| 0.9347222222222222 | 0 |
| 0.9354166666666667 | 0 |
| 0.936111111111111 | 0 |
| 0.9368055555555556 | 0 |
| 0.9375 | 0 |
| 0.9381944444444444 | 0 |
| 0.938888888888889 | 0 |
| 0.9395833333333333 | 0 |
| 0.9402777777777778 | 0 |
| 0.9409722222222222 | 0 |
| 0.9416666666666668 | 0 |
| 0.9423611111111111 | 0 |
| 0.9430555555555555 | 0 |
| 0.94375 | 0 |
| 0.9444444444444445 | 0 |
| 0.9451388888888889 | 0 |
| 0.9458333333333333 | 0 |
| 0.9465277777777777 | 0 |
| 0.9472222222222223 | 0 |
| 0.9479166666666666 | 0 |
| 0.9486111111111111 | 0 |
| 0.9493055555555556 | 0 |
| 0.9500000000000001 | 0 |
| 0.9506944444444444 | 0 |
| 0.9513888888888888 | 0 |
| 0.9520833333333334 | 0 |
| 0.9527777777777778 | 0 |
| 0.9534722222222222 | 0 |
| 0.9541666666666666 | 0 |
| 0.9548611111111112 | 0 |
| 0.9555555555555556 | 0 |
| 0.9562499999999999 | 0 |
| 0.9569444444444444 | 0 |
| 0.9576388888888889 | 0 |
| 0.9583333333333334 | 0 |
| 0.9590277777777777 | 0 |
| 0.9597222222222223 | 0 |
| 0.9604166666666667 | 0 |
| 0.9611111111111111 | 0 |
| 0.9618055555555555 | 0 |
| 0.9625 | 0 |
| 0.9631944444444445 | 0 |
| 0.9638888888888889 | 0 |
| 0.9645833333333332 | 0 |
| 0.9652777777777778 | 0 |
| 0.9659722222222222 | 0 |
| 0.9666666666666667 | 0 |
| 0.967361111111111 | 0 |
| 0.9680555555555556 | 0 |
| 0.96875 | 0 |
| 0.9694444444444444 | 0 |
| 0.970138888888889 | 0 |
| 0.9708333333333333 | 0 |
| 0.9715277777777778 | 0 |
| 0.9722222222222222 | 0 |
| 0.9729166666666668 | 0 |
| 0.9736111111111111 | 0 |
| 0.9743055555555555 | 0 |
| 0.975 | 0 |
| 0.9756944444444445 | 0 |
| 0.9763888888888889 | 0 |
| 0.9770833333333333 | 0 |
| 0.9777777777777777 | 0 |
| 0.9784722222222223 | 0 |
| 0.9791666666666666 | 0 |
| 0.9798611111111111 | 0 |
| 0.9805555555555556 | 0 |
| 0.9812500000000001 | 0 |
| 0.9819444444444444 | 0 |
| 0.9826388888888888 | 0 |
| 0.9833333333333334 | 0 |
| 0.9840277777777778 | 0 |
| 0.9847222222222222 | 0 |
| 0.9854166666666666 | 0 |
| 0.9861111111111112 | 0 |
| 0.9868055555555556 | 0 |
| 0.9874999999999999 | 0 |
| 0.9881944444444444 | 0 |
| 0.9888888888888889 | 0 |
| 0.9895833333333334 | 0 |
| 0.9902777777777777 | 0 |
| 0.9909722222222223 | 0 |
| 0.9916666666666667 | 0 |
| 0.9923611111111111 | 0 |
| 0.9930555555555555 | 0 |
| 0.99375 | 0 |
| 0.9944444444444445 | 0 |
| 0.9951388888888889 | 0 |
| 0.9958333333333332 | 0 |
| 0.9965277777777778 | 0 |
| 0.9972222222222222 | 0 |
| 0.9979166666666667 | 0 |
| 0.998611111111111 | 0 |
| 0.9993055555555556 | 0 |